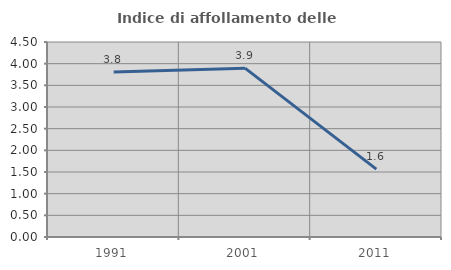
| Category | Indice di affollamento delle abitazioni  |
|---|---|
| 1991.0 | 3.807 |
| 2001.0 | 3.896 |
| 2011.0 | 1.565 |